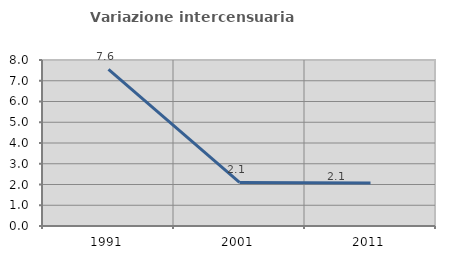
| Category | Variazione intercensuaria annua |
|---|---|
| 1991.0 | 7.551 |
| 2001.0 | 2.101 |
| 2011.0 | 2.072 |